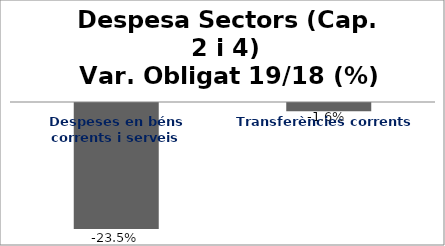
| Category | Series 0 |
|---|---|
| Despeses en béns corrents i serveis | -0.235 |
| Transferències corrents | -0.016 |